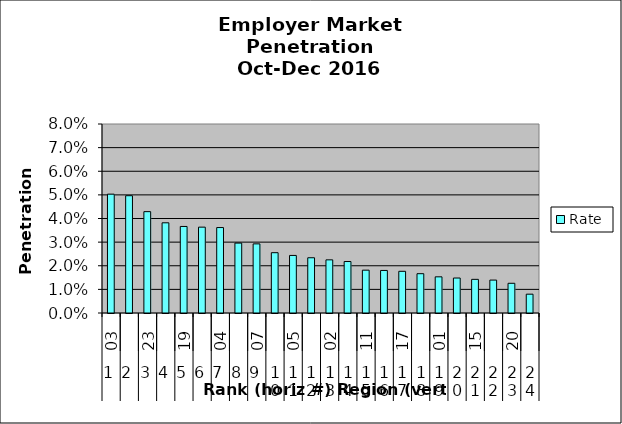
| Category | Rate |
|---|---|
| 0 | 0.05 |
| 1 | 0.05 |
| 2 | 0.043 |
| 3 | 0.038 |
| 4 | 0.037 |
| 5 | 0.036 |
| 6 | 0.036 |
| 7 | 0.03 |
| 8 | 0.029 |
| 9 | 0.026 |
| 10 | 0.024 |
| 11 | 0.023 |
| 12 | 0.022 |
| 13 | 0.022 |
| 14 | 0.018 |
| 15 | 0.018 |
| 16 | 0.018 |
| 17 | 0.017 |
| 18 | 0.015 |
| 19 | 0.015 |
| 20 | 0.014 |
| 21 | 0.014 |
| 22 | 0.013 |
| 23 | 0.008 |